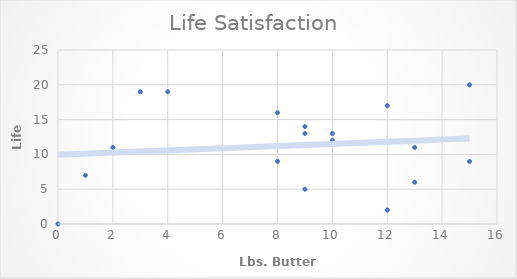
| Category | Life Satisfaction |
|---|---|
| 9.0 | 13 |
| 8.0 | 9 |
| 12.0 | 17 |
| 10.0 | 13 |
| 12.0 | 2 |
| 13.0 | 6 |
| 9.0 | 5 |
| 4.0 | 19 |
| 15.0 | 9 |
| 8.0 | 16 |
| 15.0 | 20 |
| 13.0 | 11 |
| 1.0 | 7 |
| 0.0 | 0 |
| 10.0 | 12 |
| 2.0 | 11 |
| 9.0 | 14 |
| 3.0 | 19 |